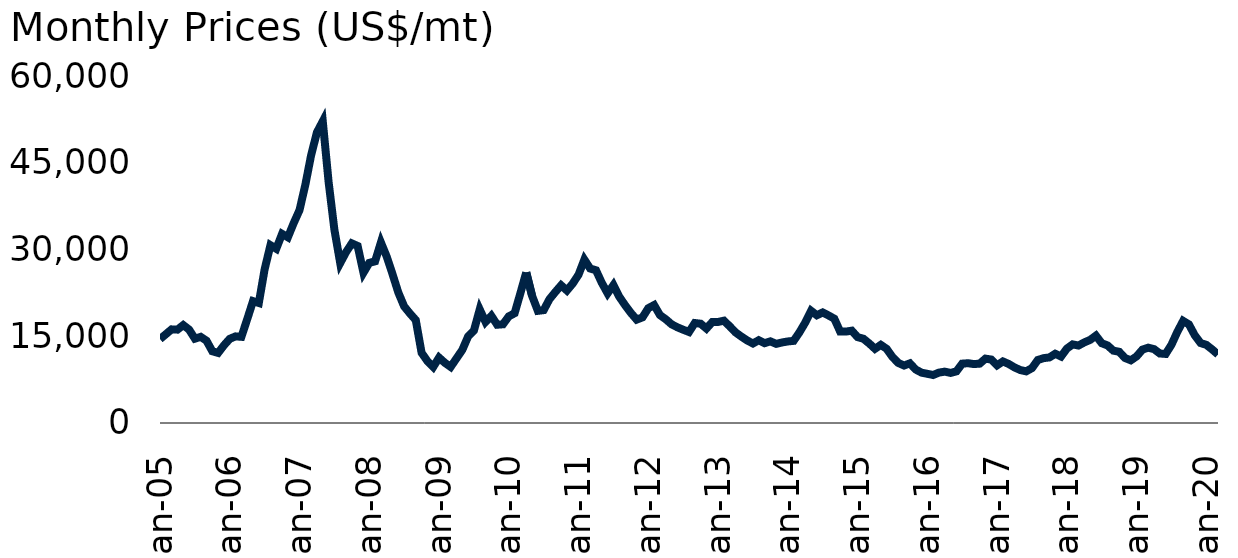
| Category | Nickel |
|---|---|
| 2005-01-01 | 14505 |
| 2005-02-01 | 15349.5 |
| 2005-03-01 | 16190.65 |
| 2005-04-01 | 16141.905 |
| 2005-05-01 | 16931.5 |
| 2005-06-01 | 16159.545 |
| 2005-07-01 | 14580.714 |
| 2005-08-01 | 14892.727 |
| 2005-09-01 | 14228.182 |
| 2005-10-01 | 12402.857 |
| 2005-11-01 | 12115.682 |
| 2005-12-01 | 13429.25 |
| 2006-01-01 | 14555.238 |
| 2006-02-01 | 14978.75 |
| 2006-03-01 | 14897.391 |
| 2006-04-01 | 17942.222 |
| 2006-05-01 | 21077.143 |
| 2006-06-01 | 20754.545 |
| 2006-07-01 | 26586.19 |
| 2006-08-01 | 30743.636 |
| 2006-09-01 | 30130.714 |
| 2006-10-01 | 32702.955 |
| 2006-11-01 | 32113.864 |
| 2006-12-01 | 34570.263 |
| 2007-01-01 | 36811.136 |
| 2007-02-01 | 41184.25 |
| 2007-03-01 | 46324.773 |
| 2007-04-01 | 50266.842 |
| 2007-05-01 | 52179.048 |
| 2007-06-01 | 41718.571 |
| 2007-07-01 | 33425.682 |
| 2007-08-01 | 27652.273 |
| 2007-09-01 | 29537.5 |
| 2007-10-01 | 31055.435 |
| 2007-11-01 | 30610.227 |
| 2007-12-01 | 25991.944 |
| 2008-01-01 | 27689.545 |
| 2008-02-01 | 27955.476 |
| 2008-03-01 | 31225.263 |
| 2008-04-01 | 28763.182 |
| 2008-05-01 | 25735 |
| 2008-06-01 | 22549.048 |
| 2008-07-01 | 20160.217 |
| 2008-08-01 | 18927.75 |
| 2008-09-01 | 17794.545 |
| 2008-10-01 | 12139.783 |
| 2008-11-01 | 10701.5 |
| 2008-12-01 | 9686.429 |
| 2009-01-01 | 11306.905 |
| 2009-02-01 | 10408.75 |
| 2009-03-01 | 9696.364 |
| 2009-04-01 | 11166 |
| 2009-05-01 | 12634.737 |
| 2009-06-01 | 14960.455 |
| 2009-07-01 | 15984.565 |
| 2009-08-01 | 19641.75 |
| 2009-09-01 | 17473.182 |
| 2009-10-01 | 18525.227 |
| 2009-11-01 | 16991.19 |
| 2009-12-01 | 17066.429 |
| 2010-01-01 | 18439.25 |
| 2010-02-01 | 18976 |
| 2010-03-01 | 22461.304 |
| 2010-04-01 | 26030.75 |
| 2010-05-01 | 22008.158 |
| 2010-06-01 | 19388.636 |
| 2010-07-01 | 19517.5 |
| 2010-08-01 | 21413.333 |
| 2010-09-01 | 22643.409 |
| 2010-10-01 | 23807.381 |
| 2010-11-01 | 22909.318 |
| 2010-12-01 | 24111.19 |
| 2011-01-01 | 25646.25 |
| 2011-02-01 | 28252.25 |
| 2011-03-01 | 26710.35 |
| 2011-04-01 | 26408.33 |
| 2011-05-01 | 24236.73 |
| 2011-06-01 | 22420.93 |
| 2011-07-01 | 23847.95 |
| 2011-08-01 | 21845.09 |
| 2011-09-01 | 20377.59 |
| 2011-10-01 | 19039.05 |
| 2011-11-01 | 17873 |
| 2011-12-01 | 18266.76 |
| 2012-01-01 | 19854.77 |
| 2012-02-01 | 20393.67 |
| 2012-03-01 | 18660.81 |
| 2012-04-01 | 17939.79 |
| 2012-05-01 | 17068.19 |
| 2012-06-01 | 16549.143 |
| 2012-07-01 | 16128.409 |
| 2012-08-01 | 15735.207 |
| 2012-09-01 | 17287.96 |
| 2012-10-01 | 17168.74 |
| 2012-11-01 | 16335.364 |
| 2012-12-01 | 17448.5 |
| 2013-01-01 | 17472.5 |
| 2013-02-01 | 17690.1 |
| 2013-03-01 | 16724.929 |
| 2013-04-01 | 15672.955 |
| 2013-05-01 | 14947.957 |
| 2013-06-01 | 14280.275 |
| 2013-07-01 | 13750.315 |
| 2013-08-01 | 14314.932 |
| 2013-09-01 | 13801.393 |
| 2013-10-01 | 14117.652 |
| 2013-11-01 | 13684.012 |
| 2013-12-01 | 13924.55 |
| 2014-01-01 | 14101.25 |
| 2014-02-01 | 14203.55 |
| 2014-03-01 | 15678.1 |
| 2014-04-01 | 17373.6 |
| 2014-05-01 | 19401.08 |
| 2014-06-01 | 18628.81 |
| 2014-07-01 | 19117.65 |
| 2014-08-01 | 18600.2 |
| 2014-09-01 | 18034.8 |
| 2014-10-01 | 15812.37 |
| 2014-11-01 | 15807.05 |
| 2014-12-01 | 15962.05 |
| 2015-01-01 | 14849.19 |
| 2015-02-01 | 14573.84 |
| 2015-03-01 | 13755.5 |
| 2015-04-01 | 12830.92 |
| 2015-05-01 | 13511.34 |
| 2015-06-01 | 12825.23 |
| 2015-07-01 | 11413.1 |
| 2015-08-01 | 10386 |
| 2015-09-01 | 9937.55 |
| 2015-10-01 | 10316.83 |
| 2015-11-01 | 9244.33 |
| 2015-12-01 | 8707.79 |
| 2016-01-01 | 8507.29 |
| 2016-02-01 | 8298.5 |
| 2016-03-01 | 8717.25 |
| 2016-04-01 | 8878.86 |
| 2016-05-01 | 8660.35 |
| 2016-06-01 | 8928.35 |
| 2016-07-01 | 10262.86 |
| 2016-08-01 | 10335.99 |
| 2016-09-01 | 10191.78 |
| 2016-10-01 | 10259.74 |
| 2016-11-01 | 11128.91 |
| 2016-12-01 | 10972.27 |
| 2017-01-01 | 9971.46 |
| 2017-02-01 | 10643.3 |
| 2017-03-01 | 10204.66 |
| 2017-04-01 | 9609.28 |
| 2017-05-01 | 9155.12 |
| 2017-06-01 | 8931.76 |
| 2017-07-01 | 9491.39 |
| 2017-08-01 | 10889.98 |
| 2017-09-01 | 11215.79 |
| 2017-10-01 | 11335.77 |
| 2017-11-01 | 11972 |
| 2017-12-01 | 11495.11 |
| 2018-01-01 | 12864.88 |
| 2018-02-01 | 13595.88 |
| 2018-03-01 | 13392.5 |
| 2018-04-01 | 13938.1 |
| 2018-05-01 | 14366.49 |
| 2018-06-01 | 15105.65 |
| 2018-07-01 | 13793.86 |
| 2018-08-01 | 13411.35 |
| 2018-09-01 | 12510.35 |
| 2018-10-01 | 12314.91 |
| 2018-11-01 | 11239.72 |
| 2018-12-01 | 10835.08 |
| 2019-01-01 | 11523.09 |
| 2019-02-01 | 12685.23 |
| 2019-03-01 | 13026.27 |
| 2019-04-01 | 12772.79 |
| 2019-05-01 | 12016.31 |
| 2019-06-01 | 11943.94 |
| 2019-07-01 | 13546.3 |
| 2019-08-01 | 15748.64 |
| 2019-09-01 | 17656.88 |
| 2019-10-01 | 17046.22 |
| 2019-11-01 | 15171.81 |
| 2019-12-01 | 13829.42 |
| 2020-01-01 | 13506.86 |
| 2020-02-01 | 12715.55 |
| 2020-03-01 | 11846.23 |